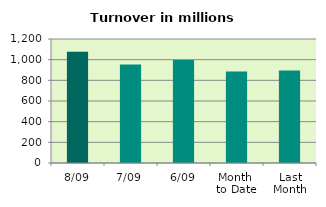
| Category | Series 0 |
|---|---|
| 8/09 | 1076.016 |
| 7/09 | 953.338 |
| 6/09 | 997.733 |
| Month 
to Date | 886.614 |
| Last
Month | 893.956 |